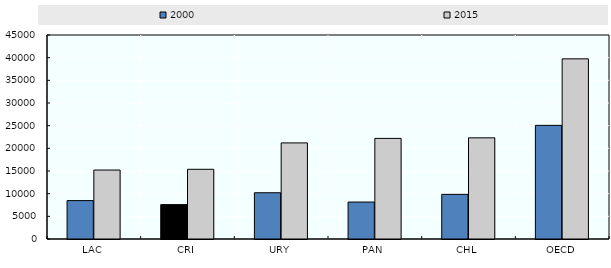
| Category | 2000 | 2015 |
|---|---|---|
| LAC | 8468.979 | 15212.923 |
| CRI | 7588.726 | 15377.23 |
| URY | 10204.914 | 21200.588 |
| PAN | 8150.858 | 22192.054 |
| CHL | 9848.898 | 22316.208 |
| OECD | 25069.923 | 39741.143 |